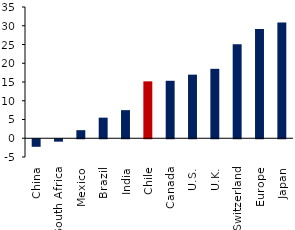
| Category | Series 0 |
|---|---|
| China | -2.011 |
| South Africa | -0.643 |
| Mexico | 2.15 |
| Brazil | 5.494 |
| India | 7.494 |
| Chile | 15.174 |
| Canada | 15.326 |
| U.S. | 16.958 |
| U.K. | 18.513 |
| Switzerland | 25.035 |
| Europe | 29.146 |
| Japan | 30.891 |